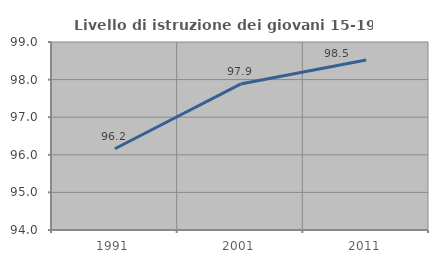
| Category | Livello di istruzione dei giovani 15-19 anni |
|---|---|
| 1991.0 | 96.161 |
| 2001.0 | 97.882 |
| 2011.0 | 98.52 |